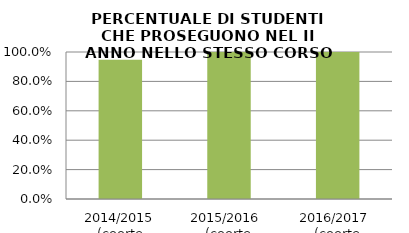
| Category | 2014/2015 (coorte 2013/14) 2015/2016  (coorte 2014/15) 2016/2017  (coorte 2015/16) |
|---|---|
| 2014/2015 (coorte 2013/14) | 0.947 |
| 2015/2016  (coorte 2014/15) | 1 |
| 2016/2017  (coorte 2015/16) | 1 |